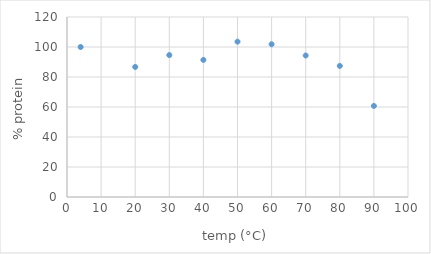
| Category | Series 0 |
|---|---|
| 4.0 | 100 |
| 20.0 | 86.705 |
| 30.0 | 94.62 |
| 40.0 | 91.397 |
| 50.0 | 103.555 |
| 60.0 | 101.824 |
| 70.0 | 94.335 |
| 80.0 | 87.38 |
| 90.0 | 60.704 |